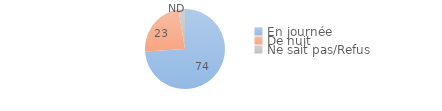
| Category | Series 0 |
|---|---|
| En journée | 73.983 |
| De nuit | 23.394 |
| Ne sait pas/Refus | 2.624 |